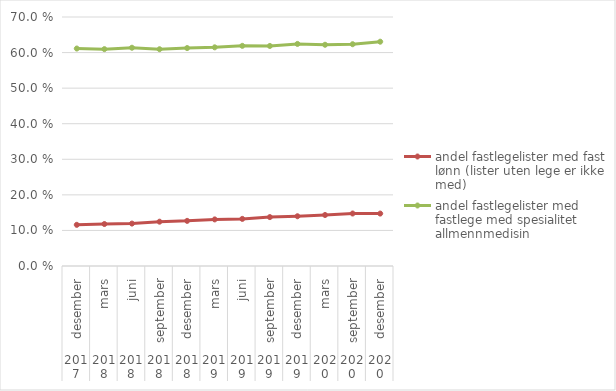
| Category | andel fastlegelister med fast lønn (lister uten lege er ikke med) | andel fastlegelister med fastlege med spesialitet allmennmedisin |
|---|---|---|
| 0 | 0.116 | 0.611 |
| 1 | 0.118 | 0.61 |
| 2 | 0.119 | 0.614 |
| 3 | 0.125 | 0.609 |
| 4 | 0.127 | 0.613 |
| 5 | 0.131 | 0.615 |
| 6 | 0.132 | 0.619 |
| 7 | 0.137 | 0.619 |
| 8 | 0.14 | 0.624 |
| 9 | 0.143 | 0.622 |
| 10 | 0.148 | 0.623 |
| 11 | 0.147 | 0.631 |